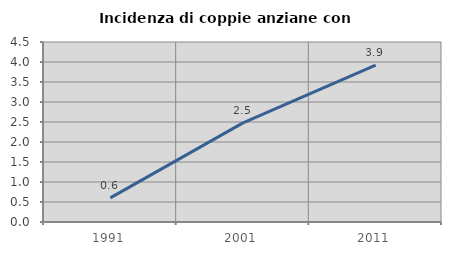
| Category | Incidenza di coppie anziane con figli |
|---|---|
| 1991.0 | 0.602 |
| 2001.0 | 2.479 |
| 2011.0 | 3.922 |